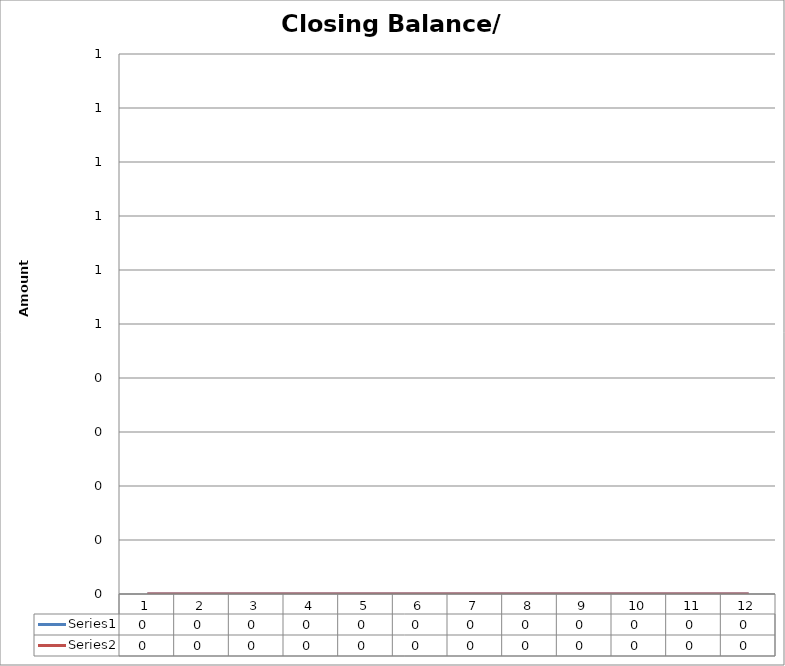
| Category | Series 0 | Series 1 |
|---|---|---|
| 0 | 0 | 0 |
| 1 | 0 | 0 |
| 2 | 0 | 0 |
| 3 | 0 | 0 |
| 4 | 0 | 0 |
| 5 | 0 | 0 |
| 6 | 0 | 0 |
| 7 | 0 | 0 |
| 8 | 0 | 0 |
| 9 | 0 | 0 |
| 10 | 0 | 0 |
| 11 | 0 | 0 |